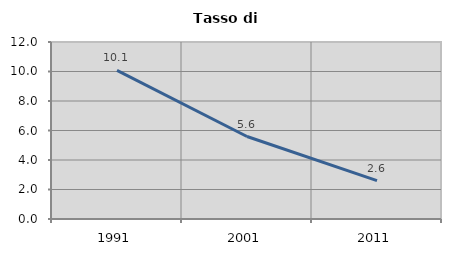
| Category | Tasso di disoccupazione   |
|---|---|
| 1991.0 | 10.072 |
| 2001.0 | 5.592 |
| 2011.0 | 2.604 |